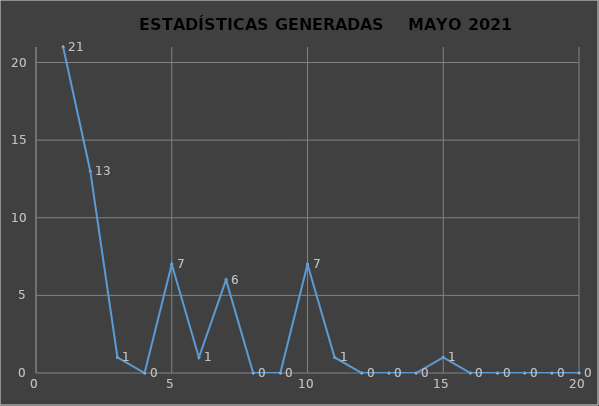
| Category |                   ESTADÍSTICAS GENERADAS     PERÍODO MAYO 2021 CANTIDAD |
|---|---|
| 0 | 21 |
| 1 | 13 |
| 2 | 1 |
| 3 | 0 |
| 4 | 7 |
| 5 | 1 |
| 6 | 6 |
| 7 | 0 |
| 8 | 0 |
| 9 | 7 |
| 10 | 1 |
| 11 | 0 |
| 12 | 0 |
| 13 | 0 |
| 14 | 1 |
| 15 | 0 |
| 16 | 0 |
| 17 | 0 |
| 18 | 0 |
| 19 | 0 |